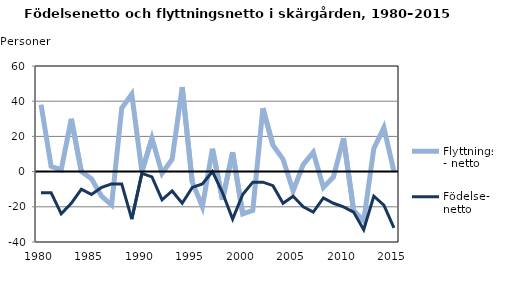
| Category | Flyttnings- netto | Födelse- netto |
|---|---|---|
| 1980.0 | 38 | -12 |
| 1981.0 | 3 | -12 |
| 1982.0 | 1 | -24 |
| 1983.0 | 30 | -18 |
| 1984.0 | 0 | -10 |
| 1985.0 | -4 | -13 |
| 1986.0 | -14 | -9 |
| 1987.0 | -19 | -7 |
| 1988.0 | 36 | -7 |
| 1989.0 | 44 | -27 |
| 1990.0 | 0 | -1 |
| 1991.0 | 19 | -3 |
| 1992.0 | -1 | -16 |
| 1993.0 | 7 | -11 |
| 1994.0 | 48 | -18 |
| 1995.0 | -6 | -9 |
| 1996.0 | -20 | -7 |
| 1997.0 | 13 | 0 |
| 1998.0 | -16 | -12 |
| 1999.0 | 11 | -27 |
| 2000.0 | -24 | -13 |
| 2001.0 | -22 | -6 |
| 2002.0 | 36 | -6 |
| 2003.0 | 15 | -8 |
| 2004.0 | 7 | -18 |
| 2005.0 | -11 | -14 |
| 2006.0 | 4 | -20 |
| 2007.0 | 11 | -23 |
| 2008.0 | -9 | -15 |
| 2009.0 | -3 | -18 |
| 2010.0 | 19 | -20 |
| 2011.0 | -22 | -23 |
| 2012.0 | -28 | -33 |
| 2013.0 | 13 | -14 |
| 2014.0 | 25 | -19 |
| 2015.0 | 0 | -32 |